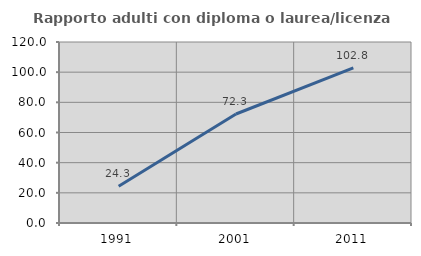
| Category | Rapporto adulti con diploma o laurea/licenza media  |
|---|---|
| 1991.0 | 24.339 |
| 2001.0 | 72.251 |
| 2011.0 | 102.841 |